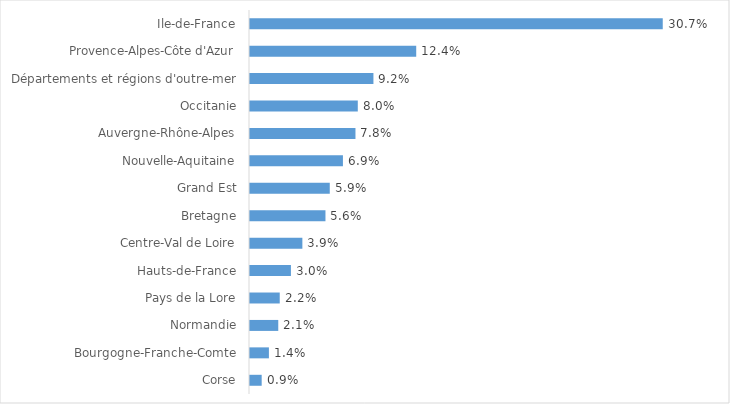
| Category | Series 0 |
|---|---|
| Corse | 0.009 |
| Bourgogne-Franche-Comte | 0.014 |
| Normandie | 0.021 |
| Pays de la Lore | 0.022 |
| Hauts-de-France | 0.03 |
| Centre-Val de Loire | 0.039 |
| Bretagne | 0.056 |
| Grand Est | 0.059 |
| Nouvelle-Aquitaine | 0.069 |
| Auvergne-Rhône-Alpes | 0.078 |
| Occitanie | 0.08 |
| Départements et régions d'outre-mer | 0.092 |
| Provence-Alpes-Côte d'Azur | 0.124 |
| Ile-de-France | 0.307 |